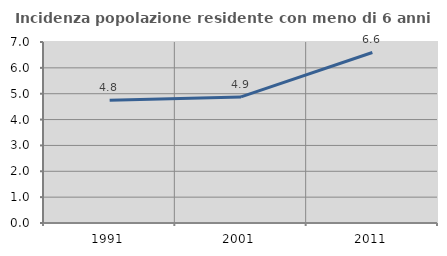
| Category | Incidenza popolazione residente con meno di 6 anni |
|---|---|
| 1991.0 | 4.752 |
| 2001.0 | 4.875 |
| 2011.0 | 6.594 |